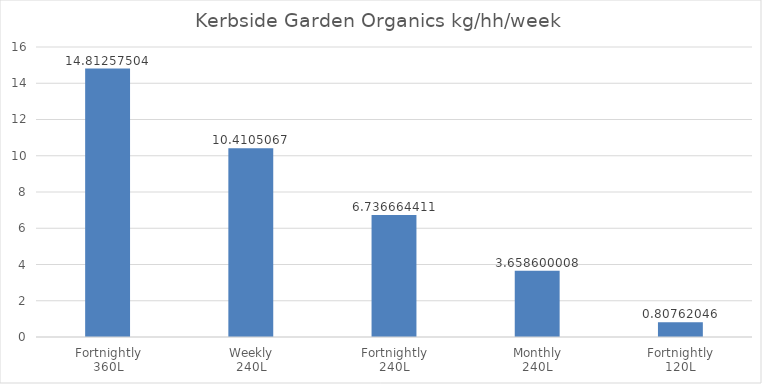
| Category | Series 0 |
|---|---|
| 0 | 14.813 |
| 1 | 10.411 |
| 2 | 6.737 |
| 3 | 3.659 |
| 4 | 0.808 |